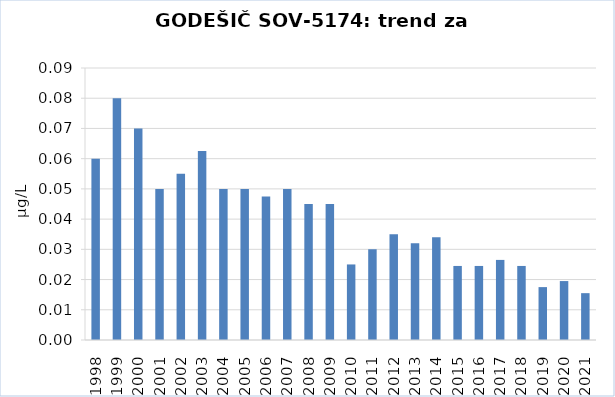
| Category | Vsota |
|---|---|
| 1998 | 0.06 |
| 1999 | 0.08 |
| 2000 | 0.07 |
| 2001 | 0.05 |
| 2002 | 0.055 |
| 2003 | 0.062 |
| 2004 | 0.05 |
| 2005 | 0.05 |
| 2006 | 0.048 |
| 2007 | 0.05 |
| 2008 | 0.045 |
| 2009 | 0.045 |
| 2010 | 0.025 |
| 2011 | 0.03 |
| 2012 | 0.035 |
| 2013 | 0.032 |
| 2014 | 0.034 |
| 2015 | 0.024 |
| 2016 | 0.024 |
| 2017 | 0.026 |
| 2018 | 0.024 |
| 2019 | 0.018 |
| 2020 | 0.02 |
| 2021 | 0.016 |